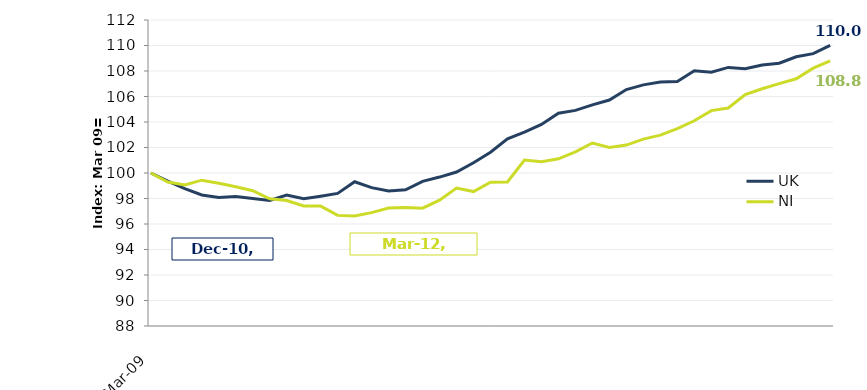
| Category | UK |
|---|---|
| 39873.0 | 100 |
| 39965.0 | 99.369 |
| 40057.0 | 98.771 |
| 40148.0 | 98.28 |
| 40238.0 | 98.087 |
| 40330.0 | 98.155 |
| 40422.0 | 98.001 |
| 40513.0 | 97.846 |
| 40603.0 | 98.269 |
| 40695.0 | 97.975 |
| 40787.0 | 98.18 |
| 40878.0 | 98.402 |
| 40969.0 | 99.312 |
| 41061.0 | 98.853 |
| 41153.0 | 98.595 |
| 41244.0 | 98.681 |
| 41334.0 | 99.344 |
| 41426.0 | 99.681 |
| 41518.0 | 100.075 |
| 41609.0 | 100.803 |
| 41699.0 | 101.627 |
| 41791.0 | 102.673 |
| 41883.0 | 103.214 |
| 41974.0 | 103.805 |
| 42064.0 | 104.687 |
| 42156.0 | 104.909 |
| 42248.0 | 105.346 |
| 42339.0 | 105.726 |
| 42430.0 | 106.547 |
| 42522.0 | 106.912 |
| 42614.0 | 107.134 |
| 42705.0 | 107.17 |
| 42795.0 | 108.012 |
| 42887.0 | 107.908 |
| 42979.0 | 108.281 |
| 43070.0 | 108.17 |
| 43160.0 | 108.467 |
| 43252.0 | 108.61 |
| 43344.0 | 109.112 |
| 43435.0 | 109.363 |
| 43525.0 | 110.008 |